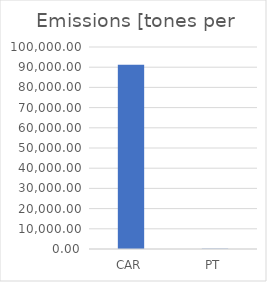
| Category | Series 0 |
|---|---|
| CAR | 91219.259 |
| PT | 142.718 |